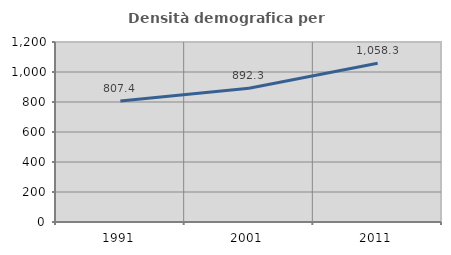
| Category | Densità demografica |
|---|---|
| 1991.0 | 807.401 |
| 2001.0 | 892.29 |
| 2011.0 | 1058.26 |